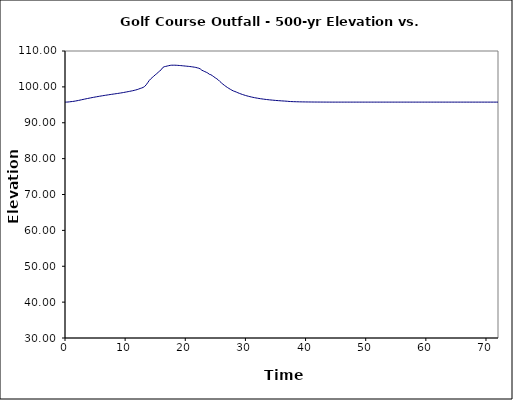
| Category | Series 1 |
|---|---|
| 0.0 | 95.75 |
| 0.25 | 95.758 |
| 0.5 | 95.784 |
| 0.75 | 95.828 |
| 1.0 | 95.88 |
| 1.25 | 95.932 |
| 1.5 | 95.989 |
| 1.75 | 96.059 |
| 2.0 | 96.138 |
| 2.25 | 96.225 |
| 2.5 | 96.314 |
| 2.75 | 96.404 |
| 3.0 | 96.494 |
| 3.25 | 96.585 |
| 3.5 | 96.673 |
| 3.75 | 96.76 |
| 4.0 | 96.845 |
| 4.25 | 96.929 |
| 4.5 | 97.01 |
| 4.75 | 97.089 |
| 5.0 | 97.167 |
| 5.25 | 97.243 |
| 5.5 | 97.317 |
| 5.75 | 97.389 |
| 6.0 | 97.461 |
| 6.25 | 97.53 |
| 6.5 | 97.597 |
| 6.75 | 97.664 |
| 7.0 | 97.73 |
| 7.25 | 97.794 |
| 7.5 | 97.857 |
| 7.75 | 97.92 |
| 8.0 | 97.981 |
| 8.25 | 98.041 |
| 8.5 | 98.103 |
| 8.75 | 98.164 |
| 9.0 | 98.229 |
| 9.25 | 98.296 |
| 9.5 | 98.365 |
| 9.75 | 98.439 |
| 10.0 | 98.516 |
| 10.25 | 98.596 |
| 10.5 | 98.674 |
| 10.75 | 98.755 |
| 11.0 | 98.839 |
| 11.25 | 98.928 |
| 11.5 | 99.026 |
| 11.75 | 99.129 |
| 12.0 | 99.242 |
| 12.25 | 99.395 |
| 12.5 | 99.552 |
| 12.75 | 99.689 |
| 13.0 | 99.853 |
| 13.25 | 100.119 |
| 13.5 | 100.58 |
| 13.75 | 101.164 |
| 14.0 | 101.764 |
| 14.25 | 102.228 |
| 14.5 | 102.594 |
| 14.75 | 102.958 |
| 15.0 | 103.35 |
| 15.25 | 103.681 |
| 15.5 | 104.063 |
| 15.75 | 104.439 |
| 16.0 | 104.785 |
| 16.25 | 105.376 |
| 16.5 | 105.621 |
| 16.75 | 105.709 |
| 17.0 | 105.811 |
| 17.25 | 105.912 |
| 17.5 | 105.998 |
| 17.75 | 106.042 |
| 18.0 | 106.04 |
| 18.25 | 106.043 |
| 18.5 | 106.022 |
| 18.75 | 105.996 |
| 19.0 | 105.965 |
| 19.25 | 105.93 |
| 19.5 | 105.889 |
| 19.75 | 105.847 |
| 20.0 | 105.803 |
| 20.25 | 105.761 |
| 20.5 | 105.719 |
| 20.75 | 105.676 |
| 21.0 | 105.625 |
| 21.25 | 105.558 |
| 21.5 | 105.494 |
| 21.75 | 105.419 |
| 22.0 | 105.307 |
| 22.25 | 105.196 |
| 22.5 | 104.994 |
| 22.75 | 104.648 |
| 23.0 | 104.454 |
| 23.25 | 104.255 |
| 23.5 | 104.065 |
| 23.75 | 103.847 |
| 24.0 | 103.515 |
| 24.25 | 103.384 |
| 24.5 | 103.125 |
| 24.75 | 102.81 |
| 25.0 | 102.517 |
| 25.25 | 102.241 |
| 25.5 | 101.929 |
| 25.75 | 101.503 |
| 26.0 | 101.128 |
| 26.25 | 100.769 |
| 26.5 | 100.438 |
| 26.75 | 100.128 |
| 27.0 | 99.839 |
| 27.25 | 99.569 |
| 27.5 | 99.316 |
| 27.75 | 99.079 |
| 28.0 | 98.86 |
| 28.25 | 98.715 |
| 28.5 | 98.544 |
| 28.75 | 98.36 |
| 29.0 | 98.19 |
| 29.25 | 98.032 |
| 29.5 | 97.882 |
| 29.75 | 97.744 |
| 30.0 | 97.616 |
| 30.25 | 97.494 |
| 30.5 | 97.381 |
| 30.75 | 97.276 |
| 31.0 | 97.177 |
| 31.25 | 97.085 |
| 31.5 | 96.998 |
| 31.75 | 96.919 |
| 32.0 | 96.843 |
| 32.25 | 96.772 |
| 32.5 | 96.705 |
| 32.75 | 96.644 |
| 33.0 | 96.585 |
| 33.25 | 96.531 |
| 33.5 | 96.48 |
| 33.75 | 96.431 |
| 34.0 | 96.387 |
| 34.25 | 96.343 |
| 34.5 | 96.303 |
| 34.75 | 96.264 |
| 35.0 | 96.228 |
| 35.25 | 96.193 |
| 35.5 | 96.161 |
| 35.75 | 96.13 |
| 36.0 | 96.1 |
| 36.25 | 96.073 |
| 36.5 | 96.046 |
| 36.75 | 96.017 |
| 37.0 | 95.982 |
| 37.25 | 95.943 |
| 37.5 | 95.912 |
| 37.75 | 95.894 |
| 38.0 | 95.878 |
| 38.25 | 95.865 |
| 38.5 | 95.852 |
| 38.75 | 95.841 |
| 39.0 | 95.831 |
| 39.25 | 95.821 |
| 39.5 | 95.813 |
| 39.75 | 95.806 |
| 40.0 | 95.799 |
| 40.25 | 95.793 |
| 40.5 | 95.789 |
| 40.75 | 95.785 |
| 41.0 | 95.782 |
| 41.25 | 95.778 |
| 41.5 | 95.775 |
| 41.75 | 95.772 |
| 42.0 | 95.77 |
| 42.25 | 95.767 |
| 42.5 | 95.765 |
| 42.75 | 95.763 |
| 43.0 | 95.761 |
| 43.25 | 95.76 |
| 43.5 | 95.757 |
| 43.75 | 95.756 |
| 44.0 | 95.754 |
| 44.25 | 95.753 |
| 44.5 | 95.753 |
| 44.75 | 95.751 |
| 45.0 | 95.75 |
| 45.25 | 95.75 |
| 45.5 | 95.75 |
| 45.75 | 95.75 |
| 46.0 | 95.75 |
| 46.25 | 95.75 |
| 46.5 | 95.75 |
| 46.75 | 95.75 |
| 47.0 | 95.75 |
| 47.25 | 95.75 |
| 47.5 | 95.75 |
| 47.75 | 95.75 |
| 48.0 | 95.75 |
| 48.25 | 95.75 |
| 48.5 | 95.75 |
| 48.75 | 95.75 |
| 49.0 | 95.75 |
| 49.25 | 95.75 |
| 49.5 | 95.75 |
| 49.75 | 95.75 |
| 50.0 | 95.75 |
| 50.25 | 95.75 |
| 50.5 | 95.75 |
| 50.75 | 95.75 |
| 51.0 | 95.75 |
| 51.25 | 95.75 |
| 51.5 | 95.75 |
| 51.75 | 95.75 |
| 52.0 | 95.75 |
| 52.25 | 95.75 |
| 52.5 | 95.75 |
| 52.75 | 95.75 |
| 53.0 | 95.75 |
| 53.25 | 95.75 |
| 53.5 | 95.75 |
| 53.75 | 95.75 |
| 54.0 | 95.75 |
| 54.25 | 95.75 |
| 54.5 | 95.75 |
| 54.75 | 95.75 |
| 55.0 | 95.75 |
| 55.25 | 95.75 |
| 55.5 | 95.75 |
| 55.75 | 95.75 |
| 56.0 | 95.75 |
| 56.25 | 95.75 |
| 56.5 | 95.75 |
| 56.75 | 95.75 |
| 57.0 | 95.75 |
| 57.25 | 95.75 |
| 57.5 | 95.75 |
| 57.75 | 95.75 |
| 58.0 | 95.75 |
| 58.25 | 95.75 |
| 58.5 | 95.75 |
| 58.75 | 95.75 |
| 59.0 | 95.75 |
| 59.25 | 95.75 |
| 59.5 | 95.75 |
| 59.75 | 95.75 |
| 60.0 | 95.75 |
| 60.25 | 95.75 |
| 60.5 | 95.75 |
| 60.75 | 95.75 |
| 61.0 | 95.75 |
| 61.25 | 95.75 |
| 61.5 | 95.75 |
| 61.75 | 95.75 |
| 62.0 | 95.75 |
| 62.25 | 95.75 |
| 62.5 | 95.75 |
| 62.75 | 95.75 |
| 63.0 | 95.75 |
| 63.25 | 95.75 |
| 63.5 | 95.75 |
| 63.75 | 95.75 |
| 64.0 | 95.75 |
| 64.25 | 95.75 |
| 64.5 | 95.75 |
| 64.75 | 95.75 |
| 65.0 | 95.75 |
| 65.25 | 95.75 |
| 65.5 | 95.75 |
| 65.75 | 95.75 |
| 66.0 | 95.75 |
| 66.25 | 95.75 |
| 66.5 | 95.75 |
| 66.75 | 95.75 |
| 67.0 | 95.75 |
| 67.25 | 95.75 |
| 67.5 | 95.75 |
| 67.75 | 95.75 |
| 68.0 | 95.75 |
| 68.25 | 95.75 |
| 68.5 | 95.75 |
| 68.75 | 95.75 |
| 69.0 | 95.75 |
| 69.25 | 95.75 |
| 69.5 | 95.75 |
| 69.75 | 95.75 |
| 70.0 | 95.75 |
| 70.25 | 95.75 |
| 70.5 | 95.75 |
| 70.75 | 95.75 |
| 71.0 | 95.75 |
| 71.25 | 95.75 |
| 71.5 | 95.75 |
| 71.75 | 95.75 |
| 72.0 | 95.75 |
| 72.25 | 95.75 |
| 72.5 | 95.75 |
| 72.75 | 95.75 |
| 73.0 | 95.75 |
| 73.25 | 95.75 |
| 73.5 | 95.75 |
| 73.75 | 95.75 |
| 74.0 | 95.75 |
| 74.25 | 95.75 |
| 74.5 | 95.75 |
| 74.75 | 95.75 |
| 75.0 | 95.75 |
| 75.25 | 95.75 |
| 75.5 | 95.75 |
| 75.75 | 95.75 |
| 76.0 | 95.75 |
| 76.25 | 95.75 |
| 76.5 | 95.75 |
| 76.75 | 95.75 |
| 77.0 | 95.75 |
| 77.25 | 95.75 |
| 77.5 | 95.75 |
| 77.75 | 95.75 |
| 78.0 | 95.75 |
| 78.25 | 95.75 |
| 78.5 | 95.75 |
| 78.75 | 95.75 |
| 79.0 | 95.75 |
| 79.25 | 95.75 |
| 79.5 | 95.75 |
| 79.75 | 95.75 |
| 80.0 | 95.75 |
| 80.25 | 95.75 |
| 80.5 | 95.75 |
| 80.75 | 95.75 |
| 81.0 | 95.75 |
| 81.25 | 95.75 |
| 81.5 | 95.75 |
| 81.75 | 95.75 |
| 82.0 | 95.75 |
| 82.25 | 95.75 |
| 82.5 | 95.75 |
| 82.75 | 95.75 |
| 83.0 | 95.75 |
| 83.25 | 95.75 |
| 83.5 | 95.75 |
| 83.75 | 95.75 |
| 84.0 | 95.75 |
| 84.25 | 95.75 |
| 84.5 | 95.75 |
| 84.75 | 95.75 |
| 85.0 | 95.75 |
| 85.25 | 95.75 |
| 85.5 | 95.75 |
| 85.75 | 95.75 |
| 86.0 | 95.75 |
| 86.25 | 95.75 |
| 86.5 | 95.75 |
| 86.75 | 95.75 |
| 87.0 | 95.75 |
| 87.25 | 95.75 |
| 87.5 | 95.75 |
| 87.75 | 95.75 |
| 88.0 | 95.75 |
| 88.25 | 95.75 |
| 88.5 | 95.75 |
| 88.75 | 95.75 |
| 89.0 | 95.75 |
| 89.25 | 95.75 |
| 89.5 | 95.75 |
| 89.75 | 95.75 |
| 90.0 | 95.75 |
| 90.25 | 95.75 |
| 90.5 | 95.75 |
| 90.75 | 95.75 |
| 91.0 | 95.75 |
| 91.25 | 95.75 |
| 91.5 | 95.75 |
| 91.75 | 95.75 |
| 92.0 | 95.75 |
| 92.25 | 95.75 |
| 92.5 | 95.75 |
| 92.75 | 95.75 |
| 93.0 | 95.75 |
| 93.25 | 95.75 |
| 93.5 | 95.75 |
| 93.75 | 95.75 |
| 94.0 | 95.75 |
| 94.25 | 95.75 |
| 94.5 | 95.75 |
| 94.75 | 95.75 |
| 95.0 | 95.75 |
| 95.25 | 95.75 |
| 95.5 | 95.75 |
| 95.75 | 95.75 |
| 96.0 | 95.75 |
| 96.25 | 95.75 |
| 96.5 | 95.75 |
| 96.75 | 95.75 |
| 97.0 | 95.75 |
| 97.25 | 95.75 |
| 97.5 | 95.75 |
| 97.75 | 95.75 |
| 98.0 | 95.75 |
| 98.25 | 95.75 |
| 98.5 | 95.75 |
| 98.75 | 95.75 |
| 99.0 | 95.75 |
| 99.25 | 95.75 |
| 99.5 | 95.75 |
| 99.75 | 95.75 |
| 100.0 | 95.75 |
| 100.25 | 95.75 |
| 100.5 | 95.75 |
| 100.75 | 95.75 |
| 101.0 | 95.75 |
| 101.25 | 95.75 |
| 101.5 | 95.75 |
| 101.75 | 95.75 |
| 102.0 | 95.75 |
| 102.25 | 95.75 |
| 102.5 | 95.75 |
| 102.75 | 95.75 |
| 103.0 | 95.75 |
| 103.25 | 95.75 |
| 103.5 | 95.75 |
| 103.75 | 95.75 |
| 104.0 | 95.75 |
| 104.25 | 95.75 |
| 104.5 | 95.75 |
| 104.75 | 95.75 |
| 105.0 | 95.75 |
| 105.25 | 95.75 |
| 105.5 | 95.75 |
| 105.75 | 95.75 |
| 106.0 | 95.75 |
| 106.25 | 95.75 |
| 106.5 | 95.75 |
| 106.75 | 95.75 |
| 107.0 | 95.75 |
| 107.25 | 95.75 |
| 107.5 | 95.75 |
| 107.75 | 95.75 |
| 108.0 | 95.75 |
| 108.25 | 95.75 |
| 108.5 | 95.75 |
| 108.75 | 95.75 |
| 109.0 | 95.75 |
| 109.25 | 95.75 |
| 109.5 | 95.75 |
| 109.75 | 95.75 |
| 110.0 | 95.75 |
| 110.25 | 95.75 |
| 110.5 | 95.75 |
| 110.75 | 95.75 |
| 111.0 | 95.75 |
| 111.25 | 95.75 |
| 111.5 | 95.75 |
| 111.75 | 95.75 |
| 112.0 | 95.75 |
| 112.25 | 95.75 |
| 112.5 | 95.75 |
| 112.75 | 95.75 |
| 113.0 | 95.75 |
| 113.25 | 95.75 |
| 113.5 | 95.75 |
| 113.75 | 95.75 |
| 114.0 | 95.75 |
| 114.25 | 95.75 |
| 114.5 | 95.75 |
| 114.75 | 95.75 |
| 115.0 | 95.75 |
| 115.25 | 95.75 |
| 115.5 | 95.75 |
| 115.75 | 95.75 |
| 116.0 | 95.75 |
| 116.25 | 95.75 |
| 116.5 | 95.75 |
| 116.75 | 95.75 |
| 117.0 | 95.75 |
| 117.25 | 95.75 |
| 117.5 | 95.75 |
| 117.75 | 95.75 |
| 118.0 | 95.75 |
| 118.25 | 95.75 |
| 118.5 | 95.75 |
| 118.75 | 95.75 |
| 119.0 | 95.75 |
| 119.25 | 95.75 |
| 119.5 | 95.75 |
| 119.75 | 95.75 |
| 120.0 | 95.75 |
| 120.25 | 95.75 |
| 120.5 | 95.75 |
| 120.75 | 95.75 |
| 121.0 | 95.75 |
| 121.25 | 95.75 |
| 121.5 | 95.75 |
| 121.75 | 95.75 |
| 122.0 | 95.75 |
| 122.25 | 95.75 |
| 122.5 | 95.75 |
| 122.75 | 95.75 |
| 123.0 | 95.75 |
| 123.25 | 95.75 |
| 123.5 | 95.75 |
| 123.75 | 95.75 |
| 124.0 | 95.75 |
| 124.25 | 95.75 |
| 124.5 | 95.75 |
| 124.75 | 95.75 |
| 125.0 | 95.75 |
| 125.25 | 95.75 |
| 125.5 | 95.75 |
| 125.75 | 95.75 |
| 126.0 | 95.75 |
| 126.25 | 95.75 |
| 126.5 | 95.75 |
| 126.75 | 95.75 |
| 127.0 | 95.75 |
| 127.25 | 95.75 |
| 127.5 | 95.75 |
| 127.75 | 95.75 |
| 128.0 | 95.75 |
| 128.25 | 95.75 |
| 128.5 | 95.75 |
| 128.75 | 95.75 |
| 129.0 | 95.75 |
| 129.25 | 95.75 |
| 129.5 | 95.75 |
| 129.75 | 95.75 |
| 130.0 | 95.75 |
| 130.25 | 95.75 |
| 130.5 | 95.75 |
| 130.75 | 95.75 |
| 131.0 | 95.75 |
| 131.25 | 95.75 |
| 131.5 | 95.75 |
| 131.75 | 95.75 |
| 132.0 | 95.75 |
| 132.25 | 95.75 |
| 132.5 | 95.75 |
| 132.75 | 95.75 |
| 133.0 | 95.75 |
| 133.25 | 95.75 |
| 133.5 | 95.75 |
| 133.75 | 95.75 |
| 134.0 | 95.75 |
| 134.25 | 95.75 |
| 134.5 | 95.75 |
| 134.75 | 95.75 |
| 135.0 | 95.75 |
| 135.25 | 95.75 |
| 135.5 | 95.75 |
| 135.75 | 95.75 |
| 136.0 | 95.75 |
| 136.25 | 95.75 |
| 136.5 | 95.75 |
| 136.75 | 95.75 |
| 137.0 | 95.75 |
| 137.25 | 95.75 |
| 137.5 | 95.75 |
| 137.75 | 95.75 |
| 138.0 | 95.75 |
| 138.25 | 95.75 |
| 138.5 | 95.75 |
| 138.75 | 95.75 |
| 139.0 | 95.75 |
| 139.25 | 95.75 |
| 139.5 | 95.75 |
| 139.75 | 95.75 |
| 140.0 | 95.75 |
| 140.25 | 95.75 |
| 140.5 | 95.75 |
| 140.75 | 95.75 |
| 141.0 | 95.75 |
| 141.25 | 95.75 |
| 141.5 | 95.75 |
| 141.75 | 95.75 |
| 142.0 | 95.75 |
| 142.25 | 95.75 |
| 142.5 | 95.75 |
| 142.75 | 95.75 |
| 143.0 | 95.75 |
| 143.25 | 95.75 |
| 143.5 | 95.75 |
| 143.75 | 95.75 |
| 144.0 | 95.75 |
| 144.25 | 95.75 |
| 144.5 | 95.75 |
| 144.75 | 95.75 |
| 145.0 | 95.75 |
| 145.25 | 95.75 |
| 145.5 | 95.75 |
| 145.75 | 95.75 |
| 146.0 | 95.75 |
| 146.25 | 95.75 |
| 146.5 | 95.75 |
| 146.75 | 95.75 |
| 147.0 | 95.75 |
| 147.25 | 95.75 |
| 147.5 | 95.75 |
| 147.75 | 95.75 |
| 148.0 | 95.75 |
| 148.25 | 95.75 |
| 148.5 | 95.75 |
| 148.75 | 95.75 |
| 149.0 | 95.75 |
| 149.25 | 95.75 |
| 149.5 | 95.75 |
| 149.75 | 95.75 |
| 150.0 | 95.75 |
| 150.25 | 95.75 |
| 150.5 | 95.75 |
| 150.75 | 95.75 |
| 151.0 | 95.75 |
| 151.25 | 95.75 |
| 151.5 | 95.75 |
| 151.75 | 95.75 |
| 152.0 | 95.75 |
| 152.25 | 95.75 |
| 152.5 | 95.75 |
| 152.75 | 95.75 |
| 153.0 | 95.75 |
| 153.25 | 95.75 |
| 153.5 | 95.75 |
| 153.75 | 95.75 |
| 154.0 | 95.75 |
| 154.25 | 95.75 |
| 154.5 | 95.75 |
| 154.75 | 95.75 |
| 155.0 | 95.75 |
| 155.25 | 95.75 |
| 155.5 | 95.75 |
| 155.75 | 95.75 |
| 156.0 | 95.75 |
| 156.25 | 95.75 |
| 156.5 | 95.75 |
| 156.75 | 95.75 |
| 157.0 | 95.75 |
| 157.25 | 95.75 |
| 157.5 | 95.75 |
| 157.75 | 95.75 |
| 158.0 | 95.75 |
| 158.25 | 95.75 |
| 158.5 | 95.75 |
| 158.75 | 95.75 |
| 159.0 | 95.75 |
| 159.25 | 95.75 |
| 159.5 | 95.75 |
| 159.75 | 95.75 |
| 160.0 | 95.75 |
| 160.25 | 95.75 |
| 160.5 | 95.75 |
| 160.75 | 95.75 |
| 161.0 | 95.75 |
| 161.25 | 95.75 |
| 161.5 | 95.75 |
| 161.75 | 95.75 |
| 162.0 | 95.75 |
| 162.25 | 95.75 |
| 162.5 | 95.75 |
| 162.75 | 95.75 |
| 163.0 | 95.75 |
| 163.25 | 95.75 |
| 163.5 | 95.75 |
| 163.75 | 95.75 |
| 164.0 | 95.75 |
| 164.25 | 95.75 |
| 164.5 | 95.75 |
| 164.75 | 95.75 |
| 165.0 | 95.75 |
| 165.25 | 95.75 |
| 165.5 | 95.75 |
| 165.75 | 95.75 |
| 166.0 | 95.75 |
| 166.25 | 95.75 |
| 166.5 | 95.75 |
| 166.75 | 95.75 |
| 167.0 | 95.75 |
| 167.25 | 95.75 |
| 167.5 | 95.75 |
| 167.75 | 95.75 |
| 168.0 | 95.75 |
| 168.25 | 95.75 |
| 168.5 | 95.75 |
| 168.75 | 95.75 |
| 169.0 | 95.75 |
| 169.25 | 95.75 |
| 169.5 | 95.75 |
| 169.75 | 95.75 |
| 170.0 | 95.75 |
| 170.25 | 95.75 |
| 170.5 | 95.75 |
| 170.75 | 95.75 |
| 171.0 | 95.75 |
| 171.25 | 95.75 |
| 171.5 | 95.75 |
| 171.75 | 95.75 |
| 172.0 | 95.75 |
| 172.25 | 95.75 |
| 172.5 | 95.75 |
| 172.75 | 95.75 |
| 173.0 | 95.75 |
| 173.25 | 95.75 |
| 173.5 | 95.75 |
| 173.75 | 95.75 |
| 174.0 | 95.75 |
| 174.25 | 95.75 |
| 174.5 | 95.75 |
| 174.75 | 95.75 |
| 175.0 | 95.75 |
| 175.25 | 95.75 |
| 175.5 | 95.75 |
| 175.75 | 95.75 |
| 176.0 | 95.75 |
| 176.25 | 95.75 |
| 176.5 | 95.75 |
| 176.75 | 95.75 |
| 177.0 | 95.75 |
| 177.25 | 95.75 |
| 177.5 | 95.75 |
| 177.75 | 95.75 |
| 178.0 | 95.75 |
| 178.25 | 95.75 |
| 178.5 | 95.75 |
| 178.75 | 95.75 |
| 179.0 | 95.75 |
| 179.25 | 95.75 |
| 179.5 | 95.75 |
| 179.75 | 95.75 |
| 180.0 | 95.75 |
| 180.25 | 95.75 |
| 180.5 | 95.75 |
| 180.75 | 95.75 |
| 181.0 | 95.75 |
| 181.25 | 95.75 |
| 181.5 | 95.75 |
| 181.75 | 95.75 |
| 182.0 | 95.75 |
| 182.25 | 95.75 |
| 182.5 | 95.75 |
| 182.75 | 95.75 |
| 183.0 | 95.75 |
| 183.25 | 95.75 |
| 183.5 | 95.75 |
| 183.75 | 95.75 |
| 184.0 | 95.75 |
| 184.25 | 95.75 |
| 184.5 | 95.75 |
| 184.75 | 95.75 |
| 185.0 | 95.75 |
| 185.25 | 95.75 |
| 185.5 | 95.75 |
| 185.75 | 95.75 |
| 186.0 | 95.75 |
| 186.25 | 95.75 |
| 186.5 | 95.75 |
| 186.75 | 95.75 |
| 187.0 | 95.75 |
| 187.25 | 95.75 |
| 187.5 | 95.75 |
| 187.75 | 95.75 |
| 188.0 | 95.75 |
| 188.25 | 95.75 |
| 188.5 | 95.75 |
| 188.75 | 95.75 |
| 189.0 | 95.75 |
| 189.25 | 95.75 |
| 189.5 | 95.75 |
| 189.75 | 95.75 |
| 190.0 | 95.75 |
| 190.25 | 95.75 |
| 190.5 | 95.75 |
| 190.75 | 95.75 |
| 191.0 | 95.75 |
| 191.25 | 95.75 |
| 191.5 | 95.75 |
| 191.75 | 95.75 |